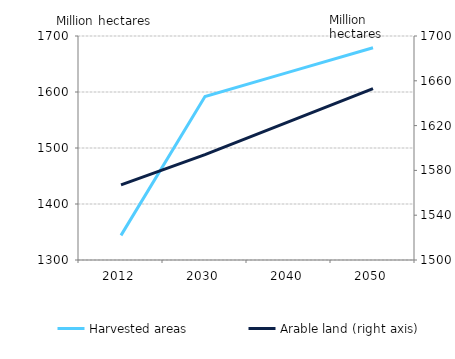
| Category | Harvested areas |
|---|---|
| 2012.0 | 1344 |
| 2030.0 | 1592 |
| 2040.0 | 1635.5 |
| 2050.0 | 1679 |